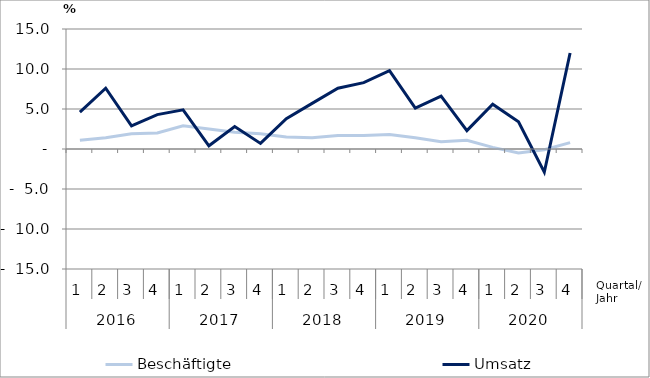
| Category | Beschäftigte | Umsatz |
|---|---|---|
| 0 | 1.1 | 4.6 |
| 1 | 1.4 | 7.6 |
| 2 | 1.9 | 2.9 |
| 3 | 2 | 4.3 |
| 4 | 2.9 | 4.9 |
| 5 | 2.5 | 0.4 |
| 6 | 2.1 | 2.8 |
| 7 | 1.9 | 0.7 |
| 8 | 1.5 | 3.8 |
| 9 | 1.4 | 5.7 |
| 10 | 1.7 | 7.6 |
| 11 | 1.7 | 8.3 |
| 12 | 1.8 | 9.8 |
| 13 | 1.4 | 5.1 |
| 14 | 0.9 | 6.6 |
| 15 | 1.1 | 2.3 |
| 16 | 0.2 | 5.6 |
| 17 | -0.5 | 3.4 |
| 18 | -0.1 | -2.9 |
| 19 | 0.8 | 12 |